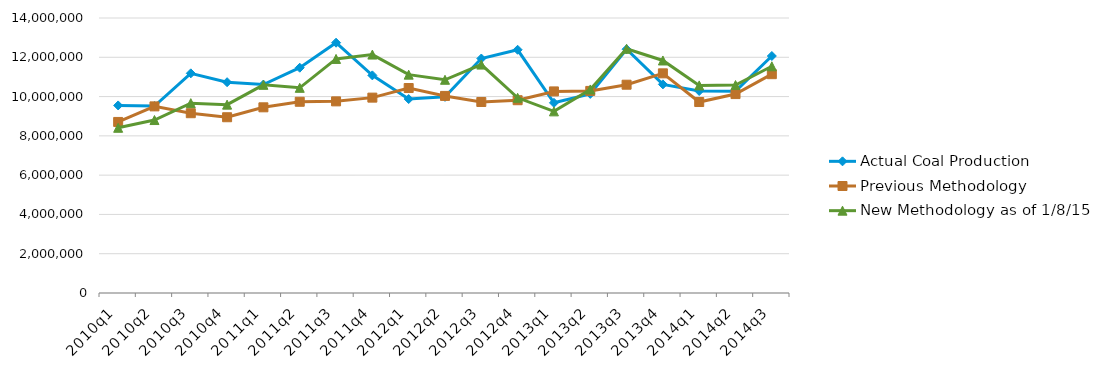
| Category | Actual Coal Production | Previous Methodology | New Methodology as of 1/8/15 |
|---|---|---|---|
| 2010q1 | 9549368 | 8707930 | 8410533 |
| 2010q2 | 9517858 | 9500354 | 8805399 |
| 2010q3 | 11183292 | 9152941 | 9664949 |
| 2010q4 | 10731483 | 8947813 | 9589625 |
| 2011q1 | 10613254 | 9453087 | 10597309 |
| 2011q2 | 11468620 | 9735302 | 10445654 |
| 2011q3 | 12742485 | 9756010 | 11916405 |
| 2011q4 | 11079238 | 9945754 | 12138070 |
| 2012q1 | 9873789 | 10435185 | 11116422 |
| 2012q2 | 9985137 | 10033489 | 10855425 |
| 2012q3 | 11937173 | 9724736 | 11628110 |
| 2012q4 | 12382126 | 9814901 | 9937516 |
| 2013q1 | 9681907 | 10262386 | 9246620 |
| 2013q2 | 10136135 | 10288339 | 10361956 |
| 2013q3 | 12410699 | 10603980 | 12430746 |
| 2013q4 | 10621878 | 11182288 | 11837211 |
| 2014q1 | 10285011 | 9722187 | 10568812 |
| 2014q2 | 10277148 | 10126555 | 10586107 |
| 2014q3 | 12065399 | 11139599 | 11541793 |